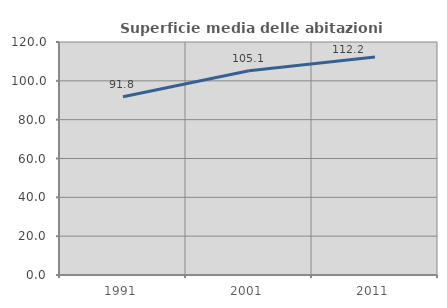
| Category | Superficie media delle abitazioni occupate |
|---|---|
| 1991.0 | 91.829 |
| 2001.0 | 105.145 |
| 2011.0 | 112.219 |